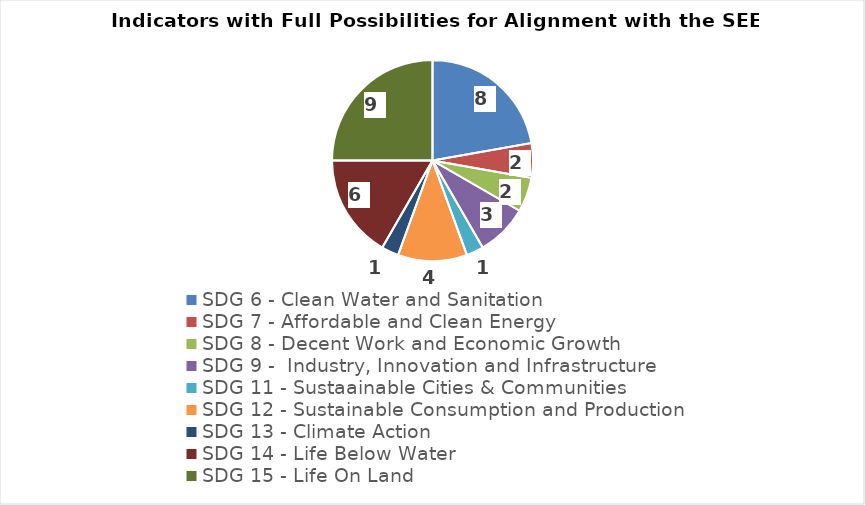
| Category | Series 0 |
|---|---|
| SDG 6 - Clean Water and Sanitation | 8 |
| SDG 7 - Affordable and Clean Energy | 2 |
| SDG 8 - Decent Work and Economic Growth | 2 |
| SDG 9 -  Industry, Innovation and Infrastructure | 3 |
| SDG 11 - Sustaainable Cities & Communities | 1 |
| SDG 12 - Sustainable Consumption and Production  | 4 |
| SDG 13 - Climate Action | 1 |
| SDG 14 - Life Below Water | 6 |
| SDG 15 - Life On Land | 9 |